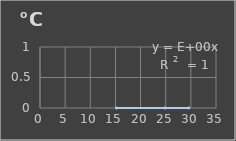
| Category | Temperatura |
|---|---|
| 15.2 | 0 |
| 24.8 | 0 |
| 29.6 | 0 |